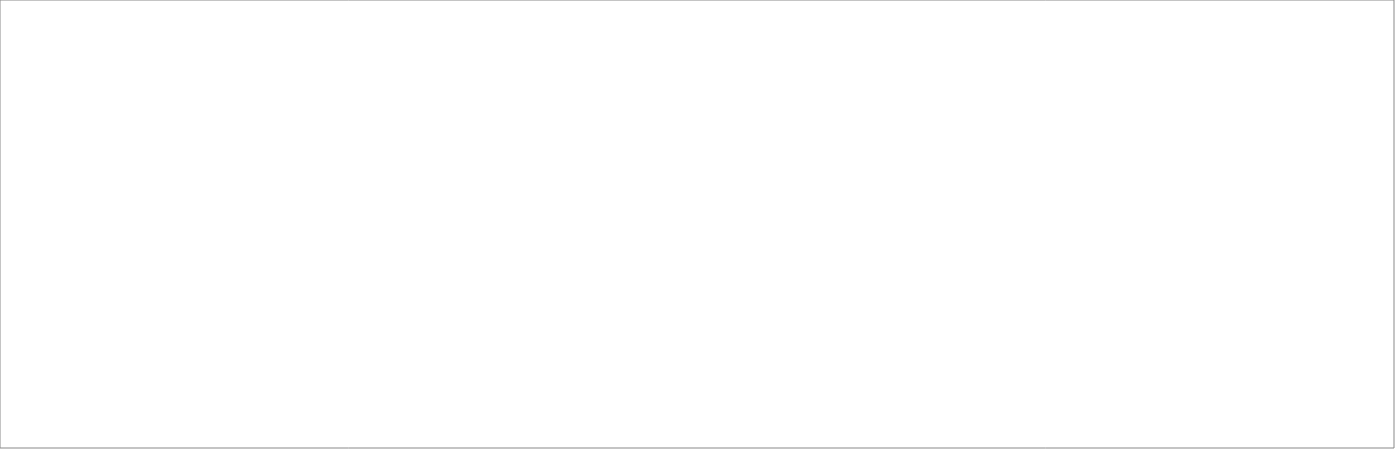
| Category | Hoteles y Restaurantes |
|---|---|
| 2018_I | 2972.956 |
| 2018_II | 2920.309 |
| 2018_III | 3523.64 |
| 2018_IV | 3909.95 |
| 2019_I | 3170.95 |
| 2019_II | 3237.994 |
| 2019_III | 0 |
| 2019_IV | 0 |